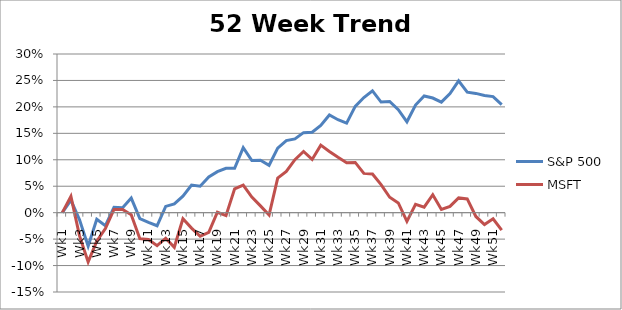
| Category | S&P 500 | MSFT |
|---|---|---|
| Wk1 | 0 | 0 |
| Wk2 | 0.024 | 0.031 |
| Wk3 | -0.014 | -0.044 |
| Wk4 | -0.063 | -0.093 |
| Wk5 | -0.012 | -0.054 |
| Wk6 | -0.024 | -0.03 |
| Wk7 | 0.01 | 0.006 |
| Wk8 | 0.009 | 0.006 |
| Wk9 | 0.028 | -0.004 |
| Wk10 | -0.011 | -0.049 |
| Wk11 | -0.018 | -0.051 |
| Wk12 | -0.025 | -0.062 |
| Wk13 | 0.012 | -0.048 |
| Wk14 | 0.016 | -0.065 |
| Wk15 | 0.031 | -0.012 |
| Wk16 | 0.052 | -0.029 |
| Wk17 | 0.05 | -0.045 |
| Wk18 | 0.067 | -0.037 |
| Wk19 | 0.077 | 0.001 |
| Wk20 | 0.084 | -0.006 |
| Wk21 | 0.084 | 0.045 |
| Wk22 | 0.123 | 0.052 |
| Wk23 | 0.099 | 0.03 |
| Wk24 | 0.099 | 0.013 |
| Wk25 | 0.09 | -0.004 |
| Wk26 | 0.122 | 0.065 |
| Wk27 | 0.136 | 0.078 |
| Wk28 | 0.14 | 0.1 |
| Wk29 | 0.151 | 0.116 |
| Wk30 | 0.152 | 0.101 |
| Wk31 | 0.165 | 0.128 |
| Wk32 | 0.185 | 0.116 |
| Wk33 | 0.176 | 0.105 |
| Wk34 | 0.169 | 0.094 |
| Wk35 | 0.201 | 0.095 |
| Wk36 | 0.218 | 0.074 |
| Wk37 | 0.23 | 0.073 |
| Wk38 | 0.209 | 0.053 |
| Wk39 | 0.21 | 0.029 |
| Wk40 | 0.195 | 0.018 |
| Wk41 | 0.172 | -0.016 |
| Wk42 | 0.204 | 0.016 |
| Wk43 | 0.221 | 0.01 |
| Wk44 | 0.217 | 0.034 |
| Wk45 | 0.209 | 0.006 |
| Wk46 | 0.225 | 0.012 |
| Wk47 | 0.249 | 0.028 |
| Wk48 | 0.228 | 0.026 |
| Wk49 | 0.226 | -0.007 |
| Wk50 | 0.221 | -0.022 |
| Wk51 | 0.219 | -0.012 |
| Wk52 | 0.204 | -0.033 |